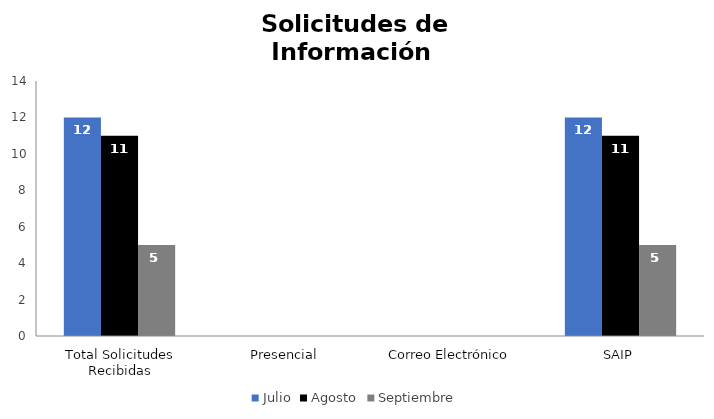
| Category | Julio | Agosto | Septiembre |
|---|---|---|---|
| Total Solicitudes Recibidas | 12 | 11 | 5 |
| Presencial | 0 | 0 | 0 |
| Correo Electrónico  | 0 | 0 | 0 |
| SAIP | 12 | 11 | 5 |